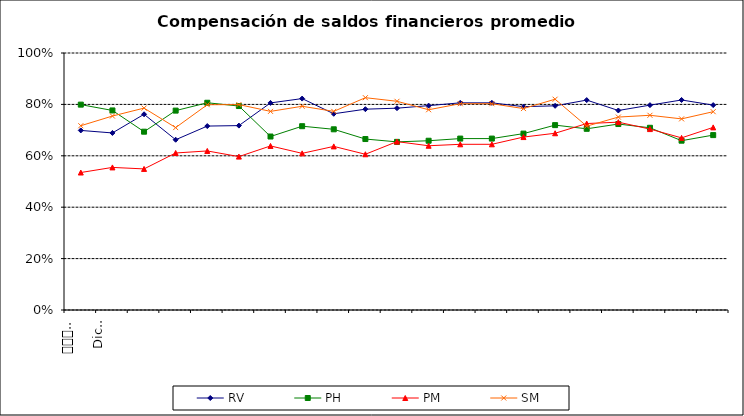
| Category | RV | PH | PM | SM |
|---|---|---|---|---|
| 0 | 0.699 | 0.799 | 0.535 | 0.717 |
| 1 | 0.689 | 0.776 | 0.555 | 0.755 |
| 2 | 0.762 | 0.694 | 0.549 | 0.786 |
| 3 | 0.662 | 0.776 | 0.611 | 0.71 |
| 4 | 0.716 | 0.806 | 0.619 | 0.799 |
| 5 | 0.718 | 0.794 | 0.597 | 0.799 |
| 6 | 0.806 | 0.675 | 0.638 | 0.773 |
| 7 | 0.823 | 0.715 | 0.61 | 0.793 |
| 8 | 0.764 | 0.703 | 0.637 | 0.773 |
| 9 | 0.781 | 0.665 | 0.606 | 0.826 |
| 10 | 0.785 | 0.654 | 0.655 | 0.812 |
| 11 | 0.795 | 0.659 | 0.639 | 0.779 |
| 12 | 0.806 | 0.667 | 0.645 | 0.803 |
| 13 | 0.806 | 0.667 | 0.645 | 0.803 |
| 14 | 0.791 | 0.686 | 0.673 | 0.784 |
| 15 | 0.794 | 0.719 | 0.688 | 0.82 |
| 16 | 0.817 | 0.705 | 0.726 | 0.715 |
| 17 | 0.776 | 0.724 | 0.731 | 0.751 |
| 18 | 0.797 | 0.709 | 0.704 | 0.758 |
| 19 | 0.817 | 0.659 | 0.67 | 0.744 |
| 20 | 0.797 | 0.681 | 0.711 | 0.772 |